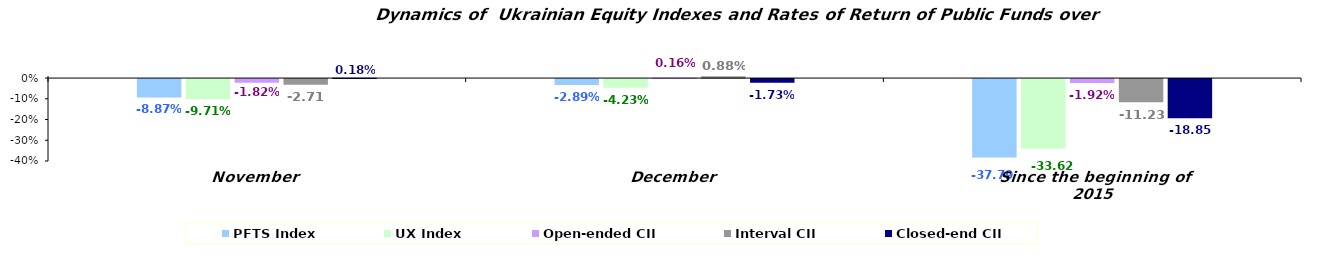
| Category | PFTS Index | UX Index | Open-ended CII | Interval CII | Closed-end CII |
|---|---|---|---|---|---|
| November | -0.089 | -0.097 | -0.018 | -0.027 | 0.002 |
| December | -0.029 | -0.042 | 0.002 | 0.009 | -0.017 |
| Since the beginning of 2015 | -0.378 | -0.336 | -0.019 | -0.112 | -0.188 |